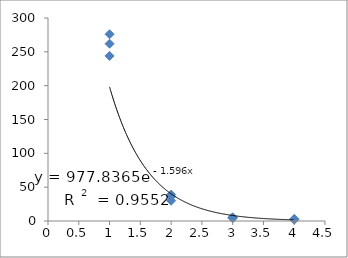
| Category | Series 0 |
|---|---|
| 1.0 | 276 |
| 1.0 | 244 |
| 1.0 | 262 |
| 2.0 | 39 |
| 2.0 | 36 |
| 2.0 | 30 |
| 3.0 | 5 |
| 3.0 | 4 |
| 3.0 | 5.5 |
| 4.0 | 2.5 |
| 4.0 | 2 |
| 4.0 | 3 |